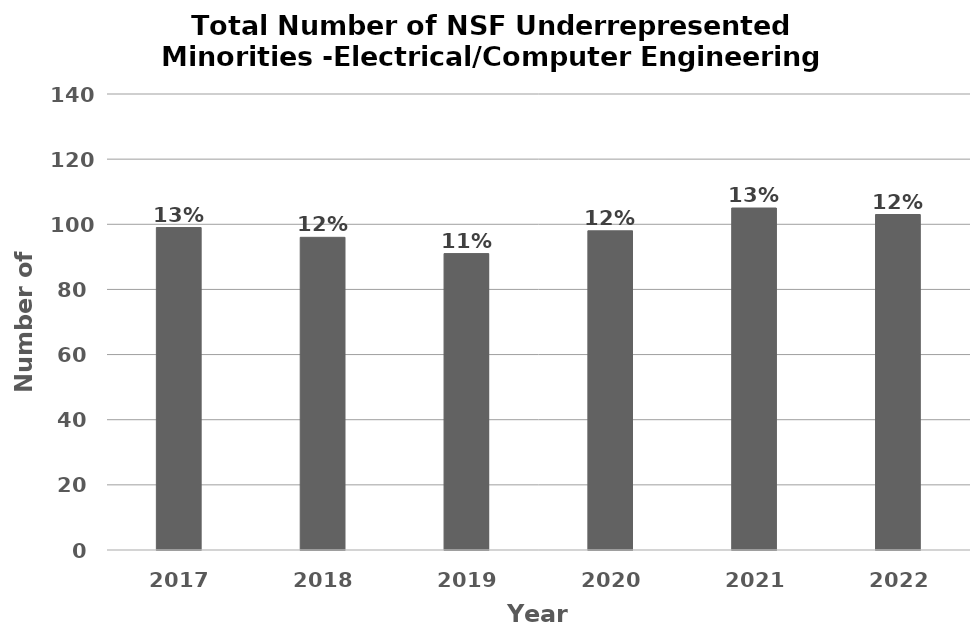
| Category | Total Number of NSF Underrepresented Electrical EngineeringStudents |
|---|---|
| 2017.0 | 99 |
| 2018.0 | 96 |
| 2019.0 | 91 |
| 2020.0 | 98 |
| 2021.0 | 105 |
| 2022.0 | 103 |